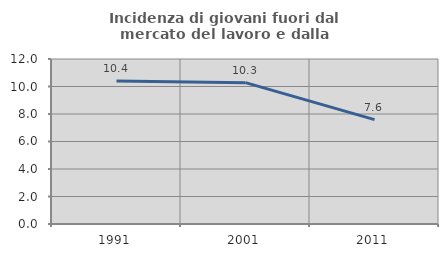
| Category | Incidenza di giovani fuori dal mercato del lavoro e dalla formazione  |
|---|---|
| 1991.0 | 10.405 |
| 2001.0 | 10.28 |
| 2011.0 | 7.595 |